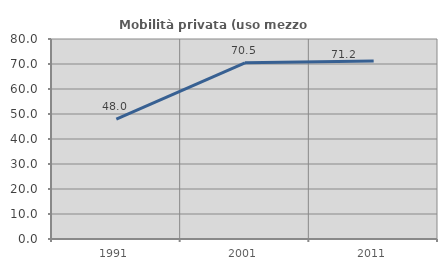
| Category | Mobilità privata (uso mezzo privato) |
|---|---|
| 1991.0 | 47.971 |
| 2001.0 | 70.45 |
| 2011.0 | 71.173 |